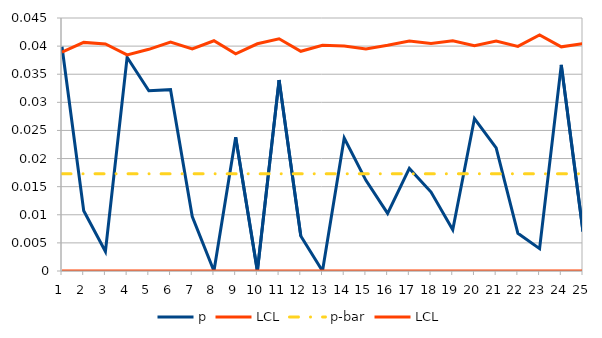
| Category | p | LCL | p-bar |
|---|---|---|---|
| 0 | 0.04 | 0.039 | 0.017 |
| 1 | 0.011 | 0.041 | 0.017 |
| 2 | 0.003 | 0.04 | 0.017 |
| 3 | 0.038 | 0.038 | 0.017 |
| 4 | 0.032 | 0.039 | 0.017 |
| 5 | 0.032 | 0.041 | 0.017 |
| 6 | 0.01 | 0.04 | 0.017 |
| 7 | 0 | 0.041 | 0.017 |
| 8 | 0.024 | 0.039 | 0.017 |
| 9 | 0 | 0.04 | 0.017 |
| 10 | 0.034 | 0.041 | 0.017 |
| 11 | 0.006 | 0.039 | 0.017 |
| 12 | 0 | 0.04 | 0.017 |
| 13 | 0.024 | 0.04 | 0.017 |
| 14 | 0.016 | 0.04 | 0.017 |
| 15 | 0.01 | 0.04 | 0.017 |
| 16 | 0.018 | 0.041 | 0.017 |
| 17 | 0.014 | 0.04 | 0.017 |
| 18 | 0.007 | 0.041 | 0.017 |
| 19 | 0.027 | 0.04 | 0.017 |
| 20 | 0.022 | 0.041 | 0.017 |
| 21 | 0.007 | 0.04 | 0.017 |
| 22 | 0.004 | 0.042 | 0.017 |
| 23 | 0.037 | 0.04 | 0.017 |
| 24 | 0.007 | 0.04 | 0.017 |